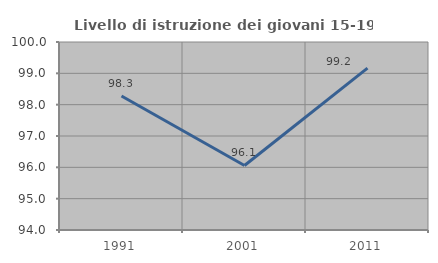
| Category | Livello di istruzione dei giovani 15-19 anni |
|---|---|
| 1991.0 | 98.276 |
| 2001.0 | 96.059 |
| 2011.0 | 99.167 |